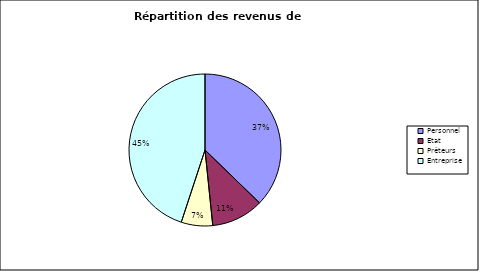
| Category | Series 0 | Series 1 |
|---|---|---|
| Personnel | 1856500 | 0.373 |
| Etat | 553600 | 0.111 |
| Prêteurs | 333300 | 0.067 |
| Entreprise | 2239750 | 0.449 |